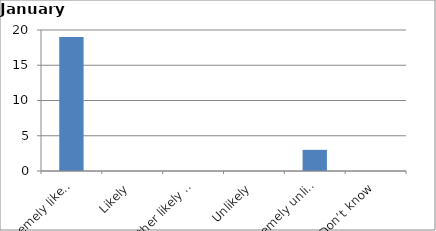
| Category | Series 0 |
|---|---|
| Extremely likely | 19 |
| Likely | 0 |
| Neither likely nor unlikely | 0 |
| Unlikely | 0 |
| Extremely unlikely | 3 |
| Don’t know | 0 |